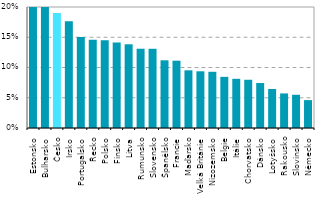
| Category | Series 0 |
|---|---|
| Estonsko | 0.355 |
| Bulharsko | 0.321 |
| Česko | 0.19 |
| Irsko | 0.177 |
| Portugalsko | 0.15 |
| Řecko | 0.146 |
| Polsko | 0.145 |
| Finsko | 0.141 |
| Litva | 0.138 |
| Rumunsko | 0.131 |
| Slovensko | 0.131 |
| Španělsko | 0.112 |
| Francie | 0.111 |
| Maďarsko | 0.095 |
| Velká Británie | 0.094 |
| Nizozemsko | 0.093 |
| Belgie | 0.085 |
| Itálie | 0.081 |
| Chorvatsko | 0.08 |
| Dánsko | 0.074 |
| Lotyšsko | 0.065 |
| Rakousko | 0.057 |
| Slovinsko | 0.055 |
| Německo | 0.046 |